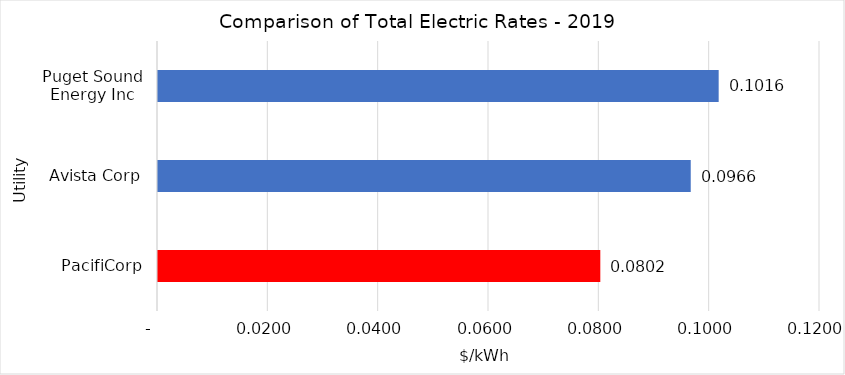
| Category | Series 0 |
|---|---|
| PacifiCorp | 0.08 |
| Avista Corp | 0.097 |
| Puget Sound Energy Inc | 0.102 |